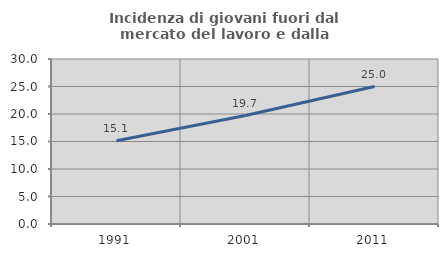
| Category | Incidenza di giovani fuori dal mercato del lavoro e dalla formazione  |
|---|---|
| 1991.0 | 15.135 |
| 2001.0 | 19.718 |
| 2011.0 | 25 |